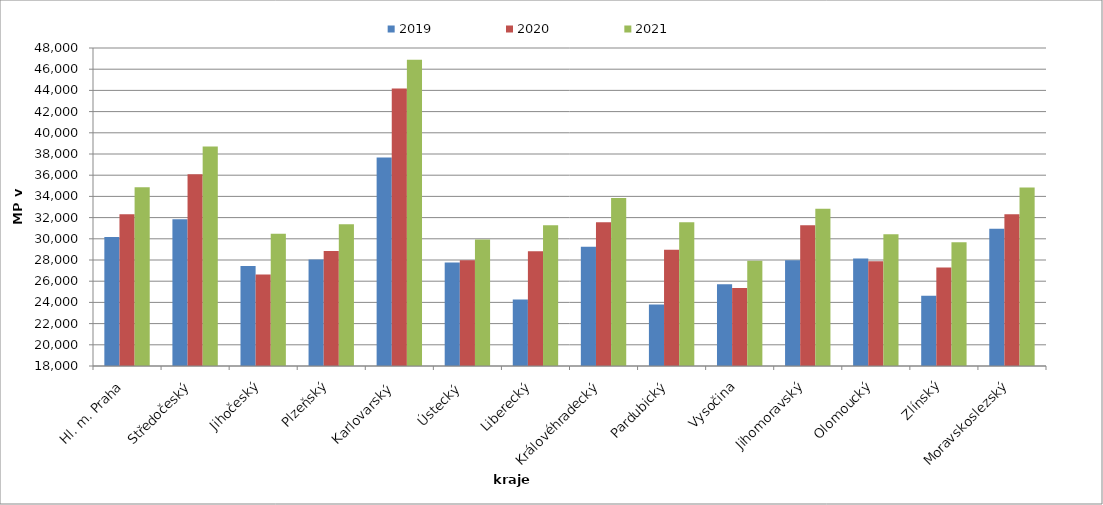
| Category | 2019 | 2020 | 2021 |
|---|---|---|---|
| Hl. m. Praha | 30171.109 | 32323.498 | 34856.977 |
| Středočeský | 31839.591 | 36093.476 | 38716.26 |
| Jihočeský | 27440.206 | 26630.39 | 30476.038 |
| Plzeňský | 28056.79 | 28857.812 | 31364.507 |
| Karlovarský  | 37673.563 | 44180 | 46899.512 |
| Ústecký   | 27763.139 | 27967.948 | 29942.418 |
| Liberecký | 24273.023 | 28834.429 | 31281.239 |
| Královéhradecký | 29239.003 | 31572.743 | 33843.804 |
| Pardubický | 23793.196 | 28960.093 | 31551.607 |
| Vysočina | 25718.784 | 25349.39 | 27920.737 |
| Jihomoravský | 27964.977 | 31270.259 | 32845.045 |
| Olomoucký | 28148.967 | 27890.799 | 30433.372 |
| Zlínský | 24635.271 | 27302.017 | 29674.761 |
| Moravskoslezský | 30937.072 | 32323.779 | 34850.945 |